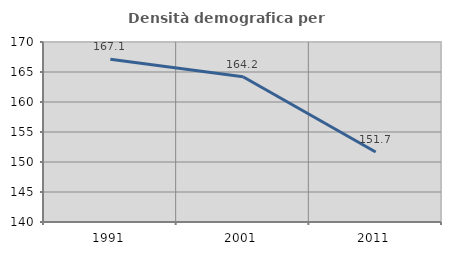
| Category | Densità demografica |
|---|---|
| 1991.0 | 167.107 |
| 2001.0 | 164.207 |
| 2011.0 | 151.668 |